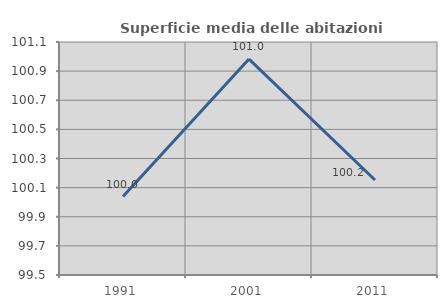
| Category | Superficie media delle abitazioni occupate |
|---|---|
| 1991.0 | 100.039 |
| 2001.0 | 100.983 |
| 2011.0 | 100.152 |